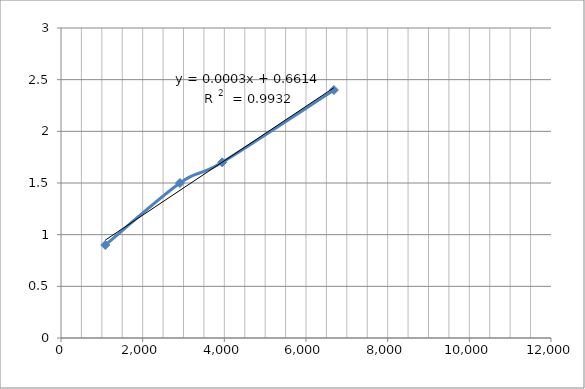
| Category | Series 0 |
|---|---|
| 1084.239245727755 | 0.9 |
| 2912.881555686505 | 1.5 |
| 3948.572775486152 | 1.7 |
| 6683.444902769593 | 2.4 |